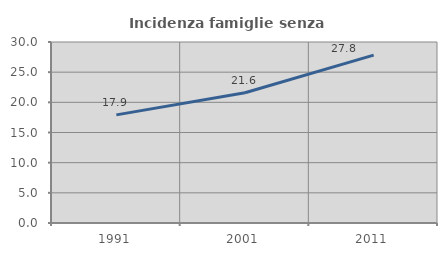
| Category | Incidenza famiglie senza nuclei |
|---|---|
| 1991.0 | 17.925 |
| 2001.0 | 21.599 |
| 2011.0 | 27.833 |